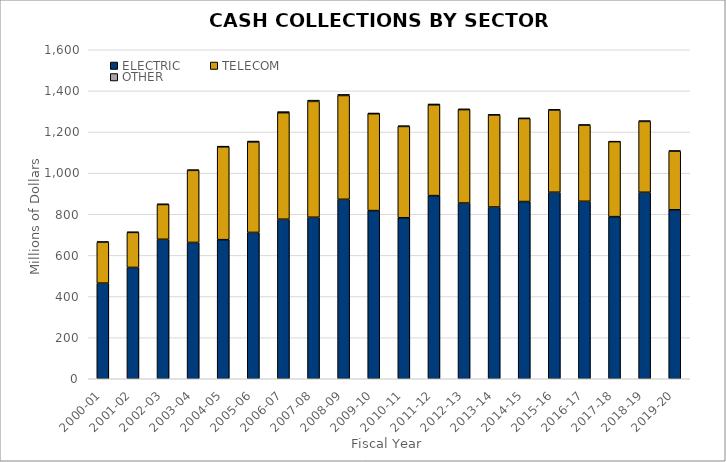
| Category | ELECTRIC | TELECOM | OTHER |
|---|---|---|---|
| 2000-01 | 465.143 | 198.727 | 3.304 |
| 2001-02 | 541.373 | 170.384 | 2.43 |
| 2002-03 | 678.317 | 169.16 | 2.938 |
| 2003-04 | 662.97 | 350.525 | 3.145 |
| 2004-05 | 676.383 | 451.474 | 3.438 |
| 2005-06 | 711.726 | 439.651 | 4.708 |
| 2006-07 | 775.864 | 518.118 | 5.188 |
| 2007-08 | 785.536 | 563.263 | 6.142 |
| 2008-09 | 872.657 | 504.92 | 5.4 |
| 2009-10 | 817.825 | 471.072 | 3.476 |
| 2010-11 | 783.124 | 443.969 | 3.429 |
| 2011-12 | 890.623 | 441.558 | 4.318 |
| 2012-13 | 854.628 | 454.401 | 3.226 |
| 2013-14 | 835.279 | 448.136 | 1.477 |
| 2014-15 | 861.979 | 403.666 | 2.427 |
| 2015-16 | 907.194 | 399.379 | 3.556 |
| 2016-17 | 863.128 | 370.265 | 2.55 |
| 2017-18 | 788.444 | 364.596 | 1.969 |
| 2018-19 | 906.924 | 344.49 | 3.957 |
| 2019-20 | 821.718 | 285.216 | 2.404 |